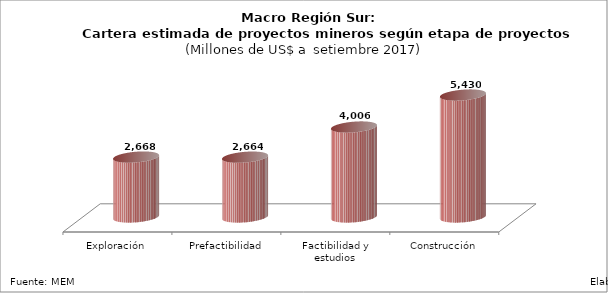
| Category | Series 0 |
|---|---|
| Exploración | 2668 |
| Prefactibilidad | 2664 |
| Factibilidad y estudios complementarios | 4006 |
| Construcción | 5430 |